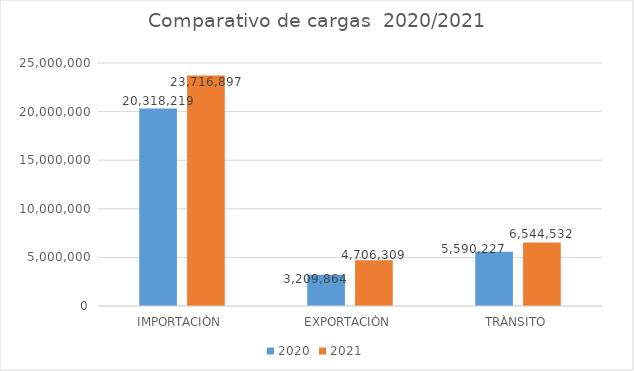
| Category | 2020 | 2021 |
|---|---|---|
| IMPORTACIÒN | 20318219.28 | 23716896.85 |
| EXPORTACIÒN | 3209864.26 | 4706308.67 |
| TRÀNSITO | 5590227 | 6544532 |